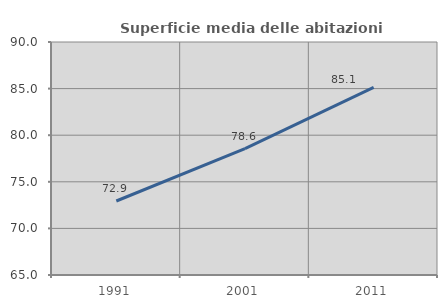
| Category | Superficie media delle abitazioni occupate |
|---|---|
| 1991.0 | 72.94 |
| 2001.0 | 78.559 |
| 2011.0 | 85.127 |